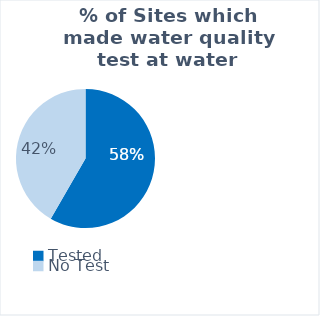
| Category | Central Rakhine |
|---|---|
| Tested | 14 |
| No Test | 10 |